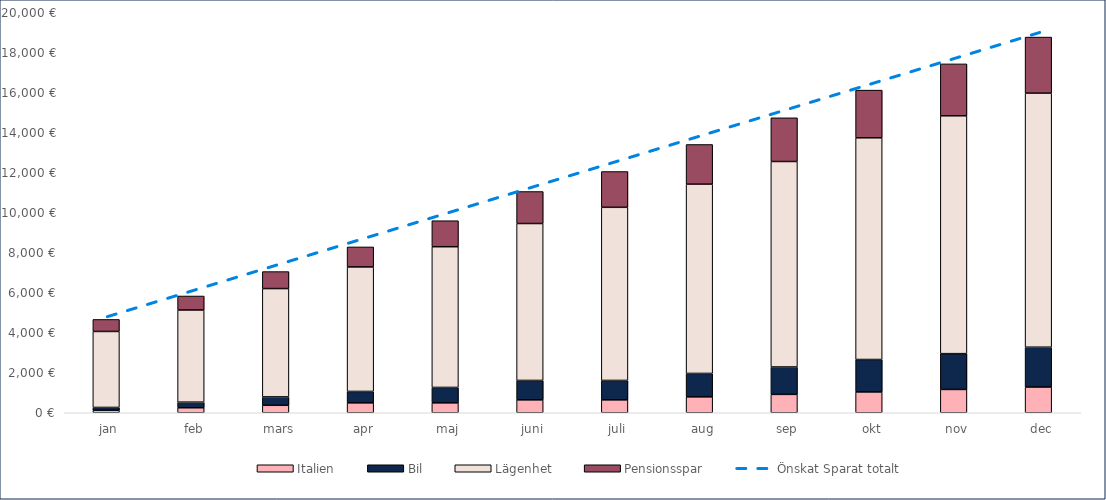
| Category | Italien | Bil | Lägenhet | Pensionsspar |
|---|---|---|---|---|
| 0 | 125 | 140 | 3800 | 600 |
| 1 | 250 | 280 | 4608 | 700 |
| 2 | 373 | 420 | 5416 | 850 |
| 3 | 496 | 570 | 6226 | 1000 |
| 4 | 496 | 770 | 7036 | 1300 |
| 5 | 646 | 970 | 7846 | 1600 |
| 6 | 646 | 970 | 8656 | 1790 |
| 7 | 796 | 1170 | 9464 | 1984 |
| 8 | 919 | 1370 | 10274 | 2184 |
| 9 | 1042 | 1620 | 11086 | 2384 |
| 10 | 1165 | 1790 | 11894 | 2594 |
| 11 | 1288 | 1990 | 12702 | 2804 |